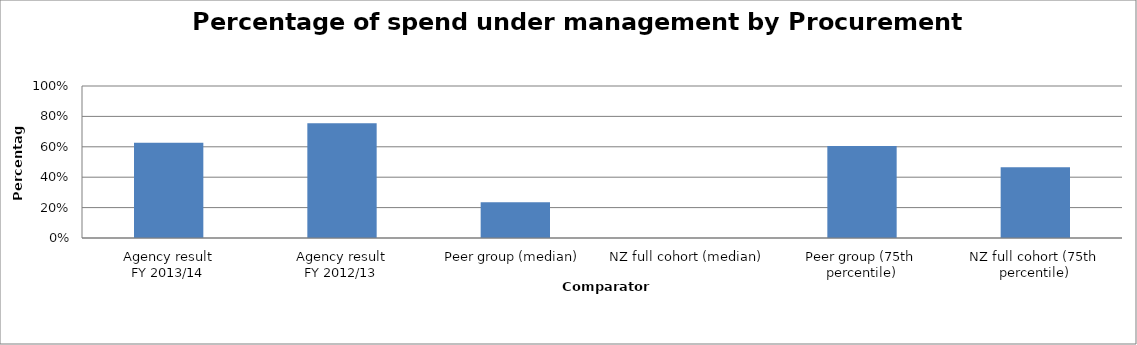
| Category | Series 0 |
|---|---|
| Agency result
FY 2013/14 | 0.626 |
| Agency result
FY 2012/13 | 0.754 |
| Peer group (median) | 0.235 |
| NZ full cohort (median) | 0 |
| Peer group (75th percentile) | 0.606 |
| NZ full cohort (75th percentile) | 0.465 |